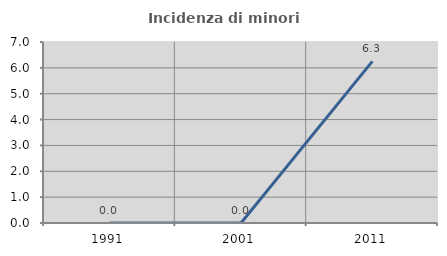
| Category | Incidenza di minori stranieri |
|---|---|
| 1991.0 | 0 |
| 2001.0 | 0 |
| 2011.0 | 6.25 |